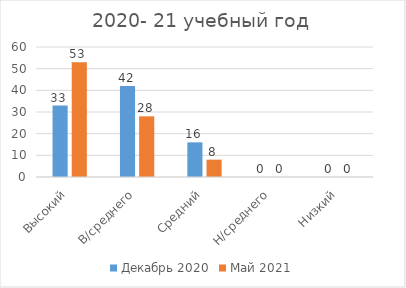
| Category | Декабрь 2020 | Май 2021 |
|---|---|---|
| Высокий | 33 | 53 |
| В/среднего | 42 | 28 |
| Средний | 16 | 8 |
| Н/среднего | 0 | 0 |
| Низкий | 0 | 0 |